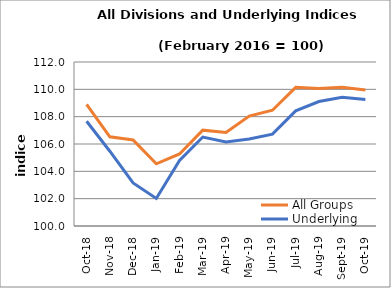
| Category | All Groups | Underlying |
|---|---|---|
| 2018-10-01 | 108.895 | 107.664 |
| 2018-11-01 | 106.524 | 105.471 |
| 2018-12-01 | 106.292 | 103.148 |
| 2019-01-01 | 104.55 | 102.019 |
| 2019-02-01 | 105.272 | 104.794 |
| 2019-03-01 | 107.012 | 106.51 |
| 2019-04-01 | 106.842 | 106.143 |
| 2019-05-01 | 108.044 | 106.37 |
| 2019-06-01 | 108.473 | 106.721 |
| 2019-07-01 | 110.146 | 108.423 |
| 2019-08-01 | 110.057 | 109.11 |
| 2019-09-01 | 110.148 | 109.423 |
| 2019-10-01 | 109.943 | 109.256 |